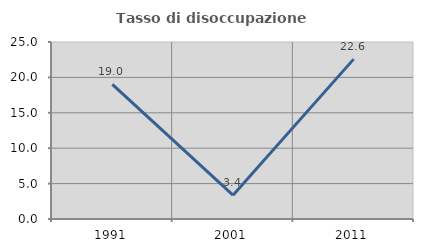
| Category | Tasso di disoccupazione giovanile  |
|---|---|
| 1991.0 | 19 |
| 2001.0 | 3.371 |
| 2011.0 | 22.581 |